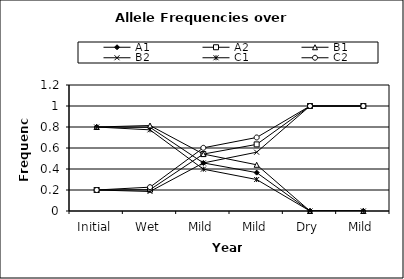
| Category | A1 | A2 | B1 | B2 | C1 | C2 |
|---|---|---|---|---|---|---|
| Initial | 0.8 | 0.2 | 0.8 | 0.2 | 0.8 | 0.2 |
| Wet | 0.797 | 0.203 | 0.814 | 0.186 | 0.773 | 0.227 |
| Mild | 0.458 | 0.542 | 0.542 | 0.458 | 0.398 | 0.602 |
| Mild | 0.365 | 0.635 | 0.44 | 0.56 | 0.3 | 0.7 |
| Dry | 0 | 1 | 0 | 1 | 0 | 1 |
| Mild | 0 | 1 | 0 | 1 | 0 | 1 |